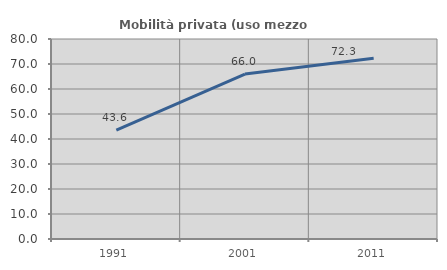
| Category | Mobilità privata (uso mezzo privato) |
|---|---|
| 1991.0 | 43.583 |
| 2001.0 | 65.974 |
| 2011.0 | 72.329 |